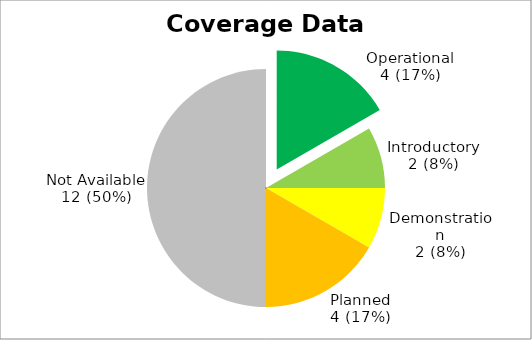
| Category | Series 0 |
|---|---|
| Operational? | 4 |
| Introductory? | 2 |
| Demonstration? | 2 |
| Planned? | 4 |
| Not Available? | 12 |